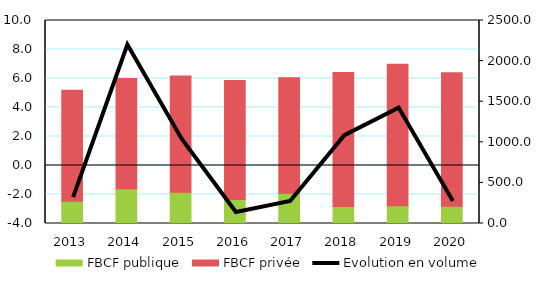
| Category | FBCF publique | FBCF privée |
|---|---|---|
| 2013 | 273.8 | 1366.7 |
| 2014 | 428.2 | 1358.3 |
| 2015 | 385.9 | 1430.9 |
| 2016 | 295.8 | 1464.9 |
| 2017 | 373.9 | 1421.4 |
| 2018 | 208.2 | 1649.9 |
| 2019 | 218.6 | 1743.6 |
| 2020 | 212.847 | 1643.836 |